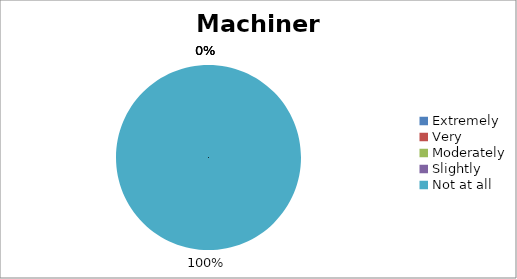
| Category | Machinery |
|---|---|
| Extremely | 0 |
| Very | 0 |
| Moderately | 0 |
| Slightly | 0 |
| Not at all | 3 |